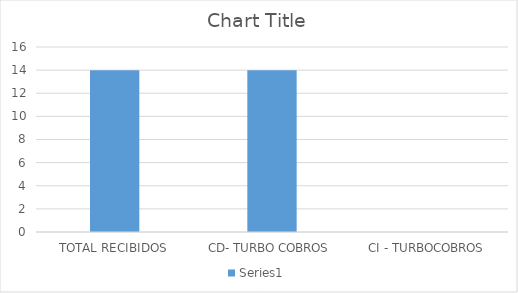
| Category | Series 0 |
|---|---|
| TOTAL RECIBIDOS | 14 |
| CD- TURBO COBROS | 14 |
| CI - TURBOCOBROS | 0 |